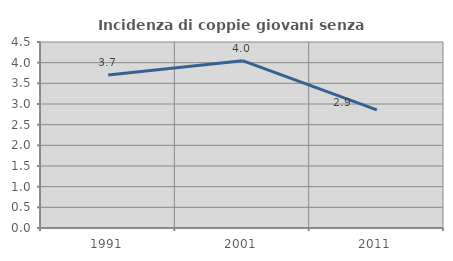
| Category | Incidenza di coppie giovani senza figli |
|---|---|
| 1991.0 | 3.704 |
| 2001.0 | 4.049 |
| 2011.0 | 2.857 |